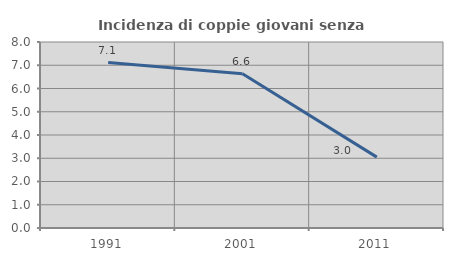
| Category | Incidenza di coppie giovani senza figli |
|---|---|
| 1991.0 | 7.116 |
| 2001.0 | 6.633 |
| 2011.0 | 3.048 |